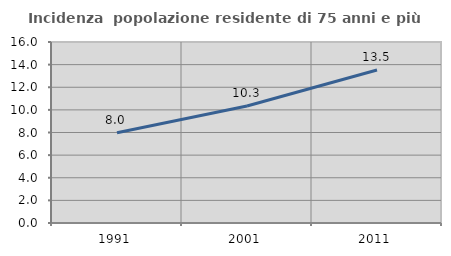
| Category | Incidenza  popolazione residente di 75 anni e più |
|---|---|
| 1991.0 | 7.974 |
| 2001.0 | 10.346 |
| 2011.0 | 13.527 |